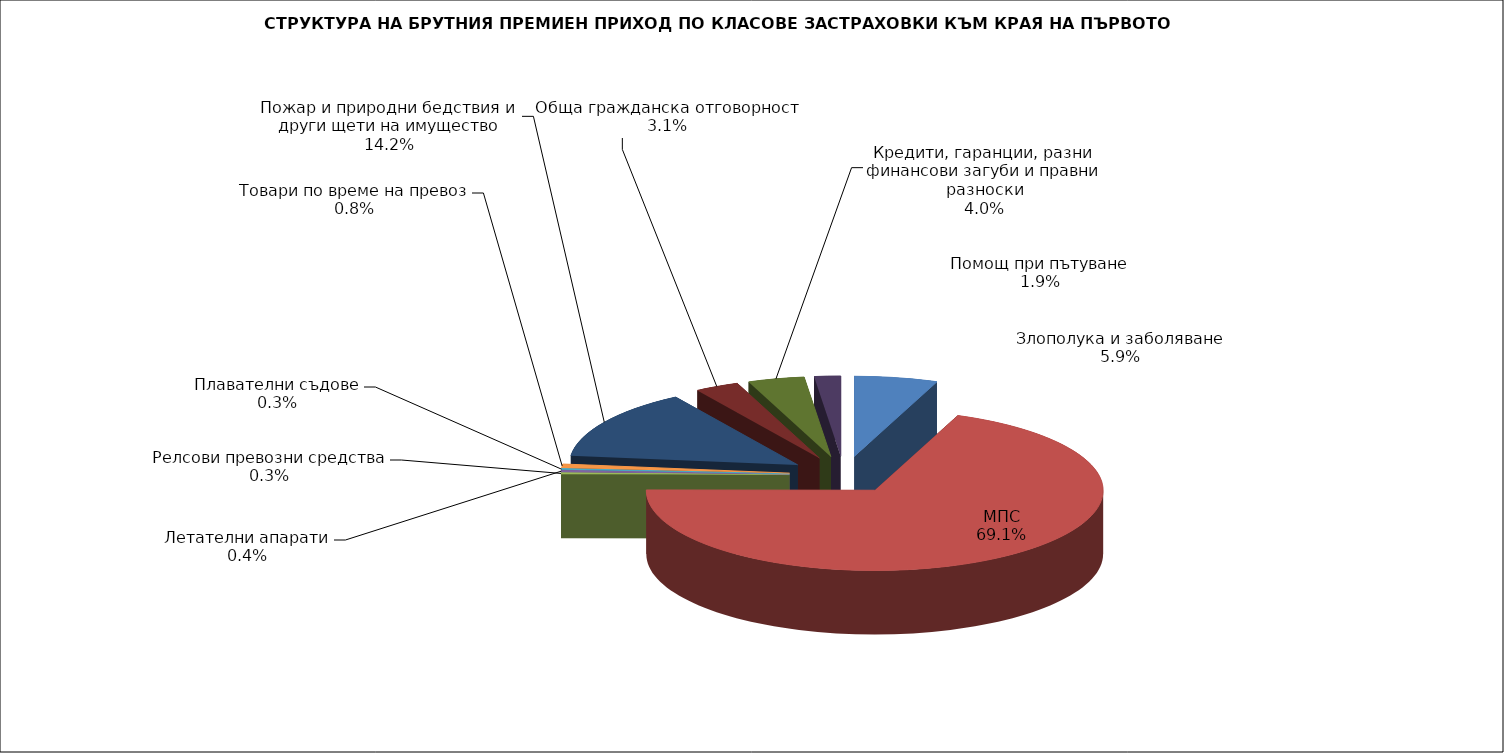
| Category | Злополука и заболяване |
|---|---|
| Злополука и заболяване | 0.059 |
| МПС | 0.691 |
| Релсови превозни средства | 0.003 |
| Летателни апарати | 0.004 |
| Плавателни съдове | 0.003 |
| Товари по време на превоз | 0.008 |
| Пожар и природни бедствия и други щети на имущество | 0.142 |
| Обща гражданска отговорност | 0.031 |
| Кредити, гаранции, разни финансови загуби и правни разноски | 0.04 |
| Помощ при пътуване | 0.019 |